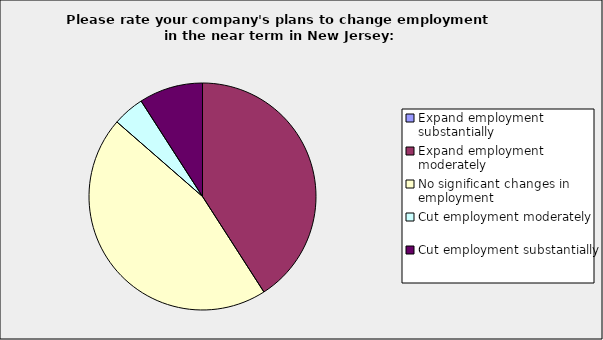
| Category | Series 0 |
|---|---|
| Expand employment substantially | 0 |
| Expand employment moderately | 0.409 |
| No significant changes in employment | 0.455 |
| Cut employment moderately | 0.045 |
| Cut employment substantially | 0.091 |